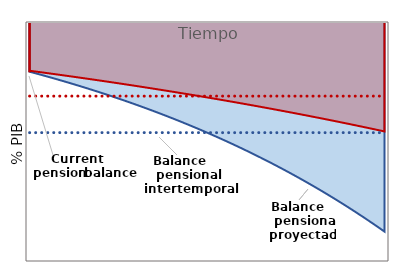
| Category | Intertemporal pension balance |
|---|---|
| 1.0 | -0.775 |
| 1.0 | -0.775 |
| 2.0 | -0.775 |
| 3.0 | -0.775 |
| 4.0 | -0.775 |
| 5.0 | -0.775 |
| 6.0 | -0.775 |
| 7.0 | -0.775 |
| 8.0 | -0.775 |
| 9.0 | -0.775 |
| 10.0 | -0.775 |
| 11.0 | -0.775 |
| 12.0 | -0.775 |
| 13.0 | -0.775 |
| 14.0 | -0.775 |
| 15.0 | -0.775 |
| 16.0 | -0.775 |
| 17.0 | -0.775 |
| 18.0 | -0.775 |
| 19.0 | -0.775 |
| 20.0 | -0.775 |
| 21.0 | -0.775 |
| 22.0 | -0.775 |
| 23.0 | -0.775 |
| 24.0 | -0.775 |
| 25.0 | -0.775 |
| 26.0 | -0.775 |
| 27.0 | -0.775 |
| 28.0 | -0.775 |
| 29.0 | -0.775 |
| 30.0 | -0.775 |
| 31.0 | -0.775 |
| 32.0 | -0.775 |
| 33.0 | -0.775 |
| 34.0 | -0.775 |
| 35.0 | -0.775 |
| 36.0 | -0.775 |
| 37.0 | -0.775 |
| 38.0 | -0.775 |
| 39.0 | -0.775 |
| 40.0 | -0.775 |
| 41.0 | -0.775 |
| 42.0 | -0.775 |
| 43.0 | -0.775 |
| 44.0 | -0.775 |
| 45.0 | -0.775 |
| 46.0 | -0.775 |
| 47.0 | -0.775 |
| 48.0 | -0.775 |
| 49.0 | -0.775 |
| 50.0 | -0.775 |